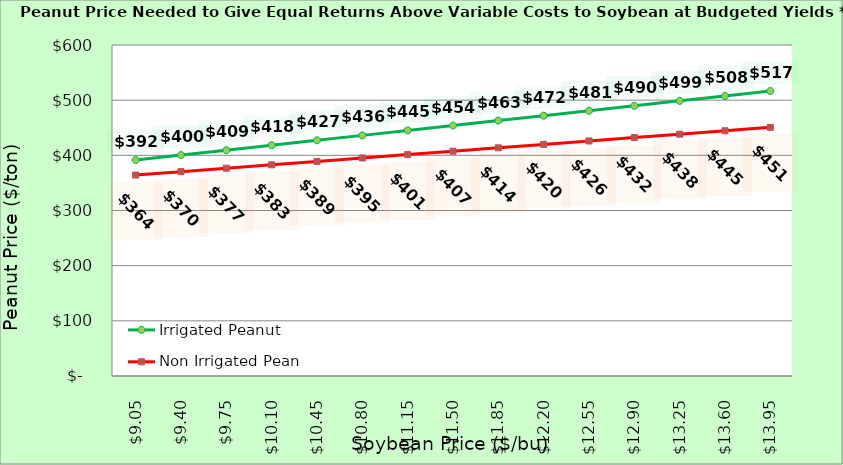
| Category | Irrigated Peanut | Non Irrigated Peanut |
|---|---|---|
| 9.050000000000002 | 391.505 | 364.264 |
| 9.400000000000002 | 400.441 | 370.441 |
| 9.750000000000002 | 409.378 | 376.617 |
| 10.100000000000001 | 418.314 | 382.794 |
| 10.450000000000001 | 427.25 | 388.97 |
| 10.8 | 436.186 | 395.147 |
| 11.15 | 445.122 | 401.323 |
| 11.5 | 454.058 | 407.5 |
| 11.85 | 462.995 | 413.676 |
| 12.2 | 471.931 | 419.853 |
| 12.549999999999999 | 480.867 | 426.029 |
| 12.899999999999999 | 489.803 | 432.205 |
| 13.249999999999998 | 498.739 | 438.382 |
| 13.599999999999998 | 507.675 | 444.558 |
| 13.949999999999998 | 516.612 | 450.735 |